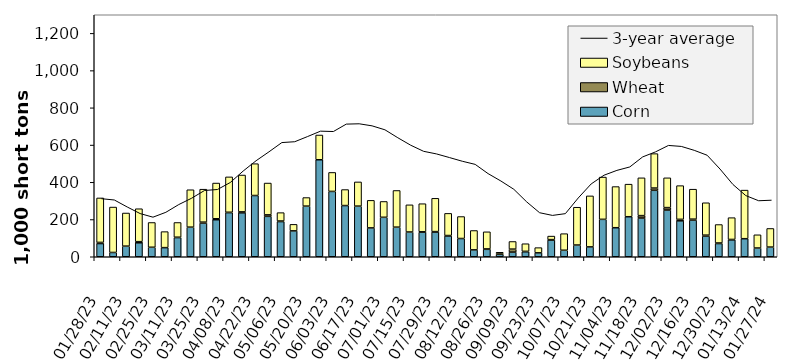
| Category | Corn | Wheat | Soybeans |
|---|---|---|---|
| 2023-01-28 | 71 | 6 | 239 |
| 2023-02-04 | 23 | 0 | 244 |
| 2023-02-11 | 57 | 0 | 178 |
| 2023-02-18 | 75 | 6 | 177 |
| 2023-02-25 | 51 | 0 | 133 |
| 2023-03-04 | 49 | 0 | 86 |
| 2023-03-11 | 103 | 2 | 79 |
| 2023-03-18 | 159 | 0 | 201 |
| 2023-03-25 | 181 | 5 | 177 |
| 2023-04-01 | 199 | 5 | 192 |
| 2023-04-08 | 237 | 2 | 190 |
| 2023-04-15 | 236 | 5 | 198 |
| 2023-04-22 | 329 | 0 | 171 |
| 2023-04-29 | 217 | 8 | 171 |
| 2023-05-06 | 189 | 3 | 45 |
| 2023-05-13 | 139 | 0 | 35 |
| 2023-05-20 | 272 | 0 | 46 |
| 2023-05-27 | 521 | 0 | 133 |
| 2023-06-03 | 351 | 0 | 102 |
| 2023-06-10 | 275 | 0 | 86 |
| 2023-06-17 | 272 | 0 | 130 |
| 2023-06-24 | 155 | 0 | 148 |
| 2023-07-01 | 212 | 0 | 85 |
| 2023-07-08 | 159 | 0 | 197 |
| 2023-07-15 | 133 | 0 | 146 |
| 2023-07-22 | 132 | 2 | 151 |
| 2023-07-29 | 133 | 2 | 179 |
| 2023-08-05 | 112 | 2 | 119 |
| 2023-08-12 | 98 | 0 | 118 |
| 2023-08-19 | 37 | 0 | 104 |
| 2023-08-26 | 40 | 2 | 92 |
| 2023-09-02 | 13 | 6 | 5 |
| 2023-09-09 | 25 | 16 | 41 |
| 2023-09-16 | 27 | 2 | 41 |
| 2023-09-23 | 21 | 0 | 28 |
| 2023-09-30 | 90 | 2 | 19 |
| 2023-10-07 | 35 | 0 | 89 |
| 2023-10-14 | 63 | 0 | 203 |
| 2023-10-21 | 53 | 0 | 274 |
| 2023-10-28 | 201 | 0 | 227 |
| 2023-11-04 | 156 | 0 | 221 |
| 2023-11-11 | 215 | 0 | 175 |
| 2023-11-18 | 208 | 13 | 203 |
| 2023-11-25 | 357 | 12 | 185 |
| 2023-12-02 | 251 | 13 | 160 |
| 2023-12-09 | 193 | 8 | 181 |
| 2023-12-16 | 197 | 5 | 161 |
| 2023-12-23 | 111 | 5 | 174 |
| 2023-12-30 | 71 | 3 | 99 |
| 2024-01-06 | 91 | 2 | 117 |
| 2024-01-13 | 97 | 0 | 261 |
| 2024-01-20 | 47 | 0 | 71 |
| 2024-01-27 | 52 | 0 | 100 |